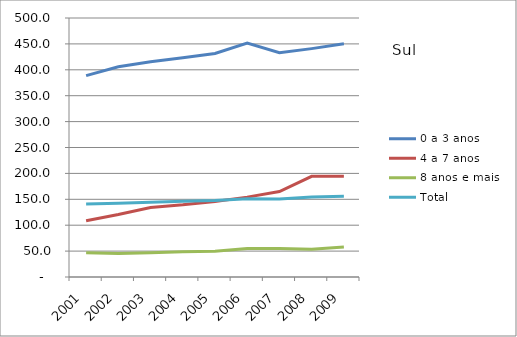
| Category | 0 a 3 anos | 4 a 7 anos | 8 anos e mais | Total |
|---|---|---|---|---|
| 2001.0 | 388.8 | 108.6 | 46.6 | 141.1 |
| 2002.0 | 405.9 | 120.6 | 45.3 | 142.3 |
| 2003.0 | 415.6 | 134.3 | 46.6 | 144.4 |
| 2004.0 | 423.3 | 139.3 | 48.9 | 146.3 |
| 2005.0 | 431.4 | 145.9 | 49.6 | 147.5 |
| 2006.0 | 451.6 | 154.2 | 55.1 | 151 |
| 2007.0 | 432.9 | 164.9 | 55.1 | 150.6 |
| 2008.0 | 440.9 | 194.4 | 53.6 | 154.4 |
| 2009.0 | 450.2 | 194.3 | 58 | 155.8 |